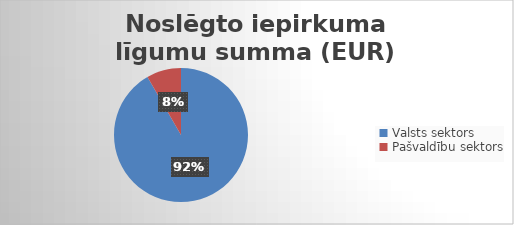
| Category | Noslēgto iepirkuma līgumu summa (EUR) bez PVN |
|---|---|
| Valsts sektors | 105153535 |
| Pašvaldību sektors | 9566501 |